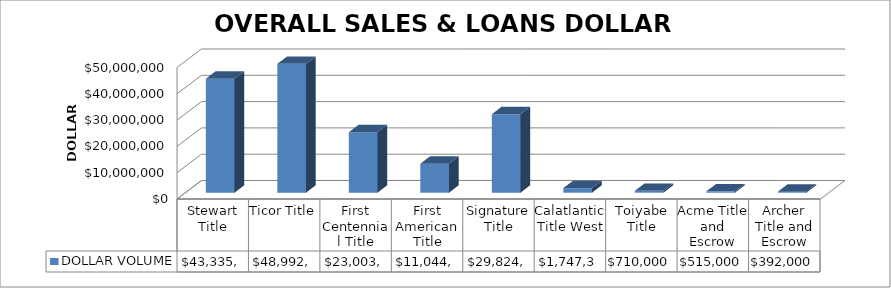
| Category | DOLLAR VOLUME |
|---|---|
| Stewart Title | 43335460 |
| Ticor Title | 48992211.5 |
| First Centennial Title | 23003698 |
| First American Title | 11044237 |
| Signature Title | 29824000 |
| Calatlantic Title West | 1747326 |
| Toiyabe Title | 710000 |
| Acme Title and Escrow | 515000 |
| Archer Title and Escrow | 392000 |